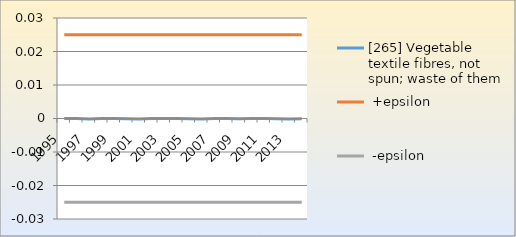
| Category | [265] Vegetable textile fibres, not spun; waste of them |  +epsilon |  -epsilon |
|---|---|---|---|
| 1995.0 | 0 | 0.025 | -0.025 |
| 1996.0 | 0 | 0.025 | -0.025 |
| 1997.0 | 0 | 0.025 | -0.025 |
| 1998.0 | 0 | 0.025 | -0.025 |
| 1999.0 | 0 | 0.025 | -0.025 |
| 2000.0 | 0 | 0.025 | -0.025 |
| 2001.0 | 0 | 0.025 | -0.025 |
| 2002.0 | 0 | 0.025 | -0.025 |
| 2003.0 | 0 | 0.025 | -0.025 |
| 2004.0 | 0 | 0.025 | -0.025 |
| 2005.0 | 0 | 0.025 | -0.025 |
| 2006.0 | 0 | 0.025 | -0.025 |
| 2007.0 | 0 | 0.025 | -0.025 |
| 2008.0 | 0 | 0.025 | -0.025 |
| 2009.0 | 0 | 0.025 | -0.025 |
| 2010.0 | 0 | 0.025 | -0.025 |
| 2011.0 | 0 | 0.025 | -0.025 |
| 2012.0 | 0 | 0.025 | -0.025 |
| 2013.0 | 0 | 0.025 | -0.025 |
| 2014.0 | 0 | 0.025 | -0.025 |